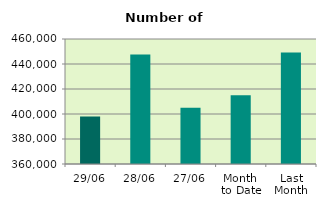
| Category | Series 0 |
|---|---|
| 29/06 | 398010 |
| 28/06 | 447510 |
| 27/06 | 405024 |
| Month 
to Date | 415003.143 |
| Last
Month | 449234.545 |